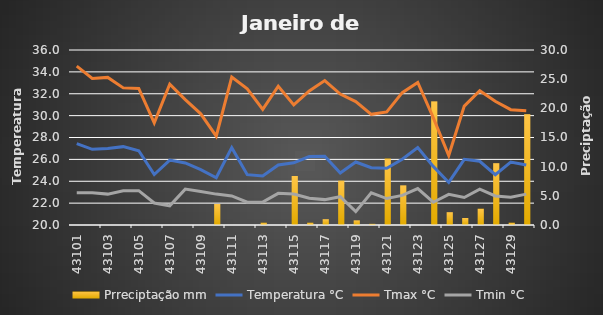
| Category | Prreciptação |
|---|---|
| 0 | 0 |
| 1/1/00 | 0 |
| 1/2/00 | 0 |
| 1/3/00 | 0 |
| 1/4/00 | 0 |
| 1/5/00 | 0 |
| 1/6/00 | 0 |
| 1/7/00 | 0 |
| 1/8/00 | 0 |
| 1/9/00 | 3.6 |
| 1/10/00 | 0 |
| 1/11/00 | 0 |
| 1/12/00 | 0.4 |
| 1/13/00 | 0 |
| 1/14/00 | 8.4 |
| 1/15/00 | 0.4 |
| 1/16/00 | 1 |
| 1/17/00 | 7.6 |
| 1/18/00 | 0.8 |
| 1/19/00 | 0.2 |
| 1/20/00 | 11.4 |
| 1/21/00 | 6.8 |
| 1/22/00 | 0 |
| 1/23/00 | 21.2 |
| 1/24/00 | 2.2 |
| 1/25/00 | 1.2 |
| 1/26/00 | 2.8 |
| 1/27/00 | 10.6 |
| 1/28/00 | 0.4 |
| 1/29/00 | 19 |
| 1/30/00 | 2 |